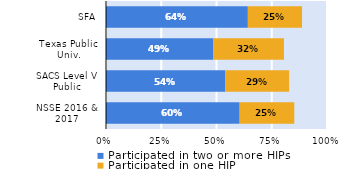
| Category | Participated in two or more HIPs | Participated in one HIP |
|---|---|---|
| NSSE 2016 & 2017 | 0.605 | 0.247 |
| SACS Level V Public | 0.539 | 0.289 |
| Texas Public Univ. | 0.486 | 0.319 |
| SFA | 0.642 | 0.245 |